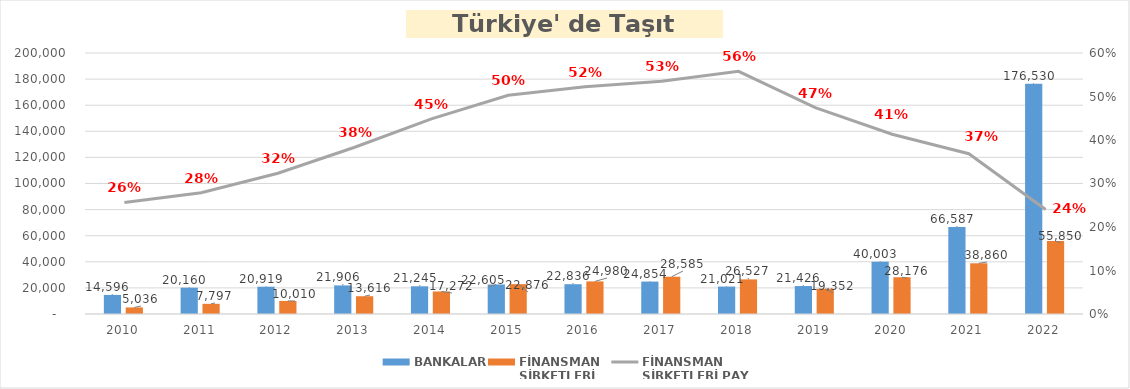
| Category | BANKALAR | FİNANSMAN 
ŞİRKETLERİ |
|---|---|---|
| 2010 | 14595.746 | 5035.89 |
| 2011 | 20160.143 | 7796.854 |
| 2012 | 20919.143 | 10009.755 |
| 2013 | 21905.99 | 13616.036 |
| 2014 | 21244.953 | 17271.844 |
| 2015 | 22605.033 | 22875.563 |
| 2016 | 22835.961 | 24980.231 |
| 2017 | 24853.571 | 28584.938 |
| 2018 | 21021.01 | 26527.133 |
| 2019 | 21426.278 | 19352.327 |
| 2020 | 40002.964 | 28176.3 |
| 2021 | 66586.576 | 38860.099 |
| 2022 | 176530.067 | 55850.334 |